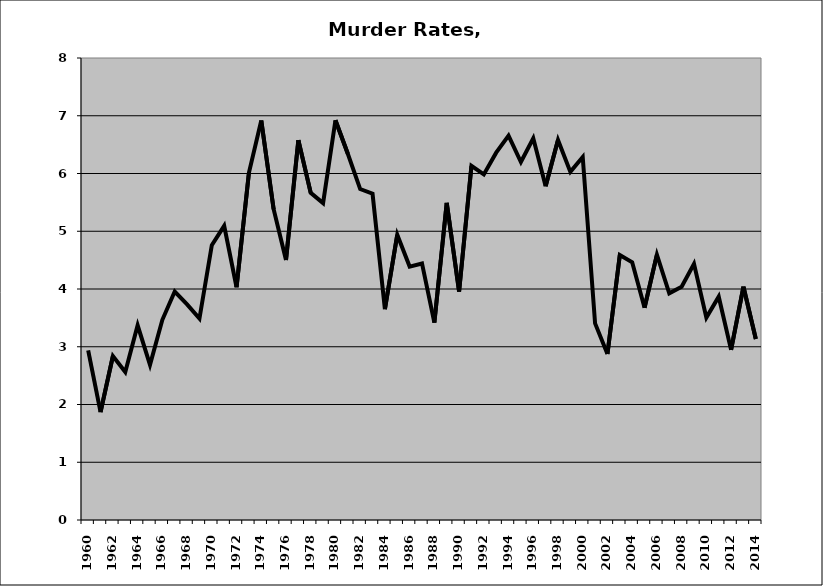
| Category | Murder |
|---|---|
| 1960.0 | 2.938 |
| 1961.0 | 1.869 |
| 1962.0 | 2.839 |
| 1963.0 | 2.562 |
| 1964.0 | 3.371 |
| 1965.0 | 2.686 |
| 1966.0 | 3.467 |
| 1967.0 | 3.956 |
| 1968.0 | 3.734 |
| 1969.0 | 3.49 |
| 1970.0 | 4.758 |
| 1971.0 | 5.093 |
| 1972.0 | 4.03 |
| 1973.0 | 6.011 |
| 1974.0 | 6.916 |
| 1975.0 | 5.382 |
| 1976.0 | 4.502 |
| 1977.0 | 6.578 |
| 1978.0 | 5.664 |
| 1979.0 | 5.488 |
| 1980.0 | 6.922 |
| 1981.0 | 6.342 |
| 1982.0 | 5.731 |
| 1983.0 | 5.649 |
| 1984.0 | 3.651 |
| 1985.0 | 4.939 |
| 1986.0 | 4.388 |
| 1987.0 | 4.443 |
| 1988.0 | 3.418 |
| 1989.0 | 5.491 |
| 1990.0 | 3.955 |
| 1991.0 | 6.132 |
| 1992.0 | 5.985 |
| 1993.0 | 6.361 |
| 1994.0 | 6.656 |
| 1995.0 | 6.199 |
| 1996.0 | 6.61 |
| 1997.0 | 5.78 |
| 1998.0 | 6.58 |
| 1999.0 | 6.029 |
| 2000.0 | 6.286 |
| 2001.0 | 3.405 |
| 2002.0 | 2.876 |
| 2003.0 | 4.588 |
| 2004.0 | 4.463 |
| 2005.0 | 3.675 |
| 2006.0 | 4.595 |
| 2007.0 | 3.927 |
| 2008.0 | 4.04 |
| 2009.0 | 4.435 |
| 2010.0 | 3.505 |
| 2011.0 | 3.867 |
| 2012.0 | 2.946 |
| 2013.0 | 4.04 |
| 2014.0 | 3.134 |